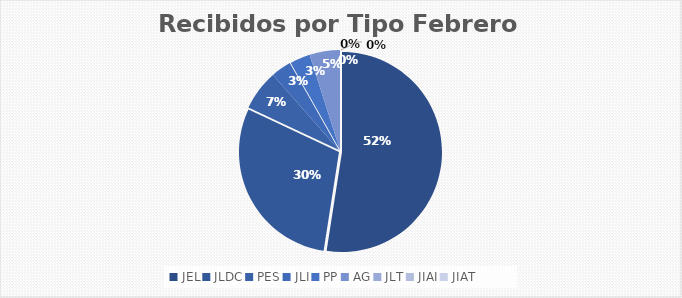
| Category | Series 0 |
|---|---|
| JEL | 32 |
| JLDC | 18 |
| PES | 4 |
| JLI | 2 |
| PP | 2 |
| AG | 3 |
| JLT | 0 |
| JIAI | 0 |
| JIAT | 0 |